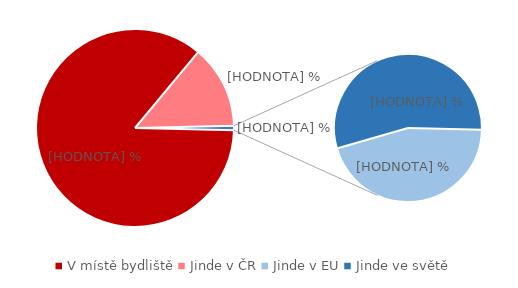
| Category | Series 0 |
|---|---|
| V místě bydliště | 85.672 |
| Jinde v ČR | 13.6 |
| Jinde v EU | 0.329 |
| Jinde ve světě | 0.399 |